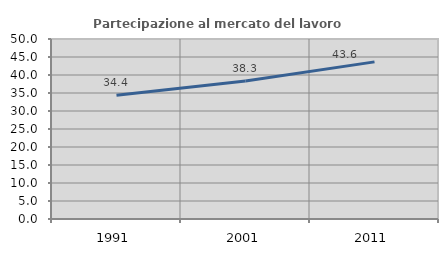
| Category | Partecipazione al mercato del lavoro  femminile |
|---|---|
| 1991.0 | 34.362 |
| 2001.0 | 38.304 |
| 2011.0 | 43.645 |